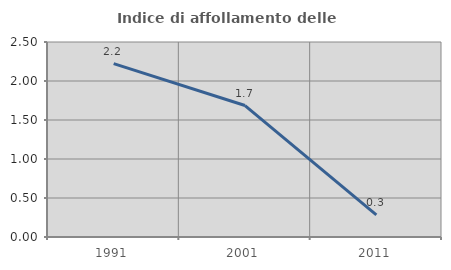
| Category | Indice di affollamento delle abitazioni  |
|---|---|
| 1991.0 | 2.222 |
| 2001.0 | 1.685 |
| 2011.0 | 0.282 |